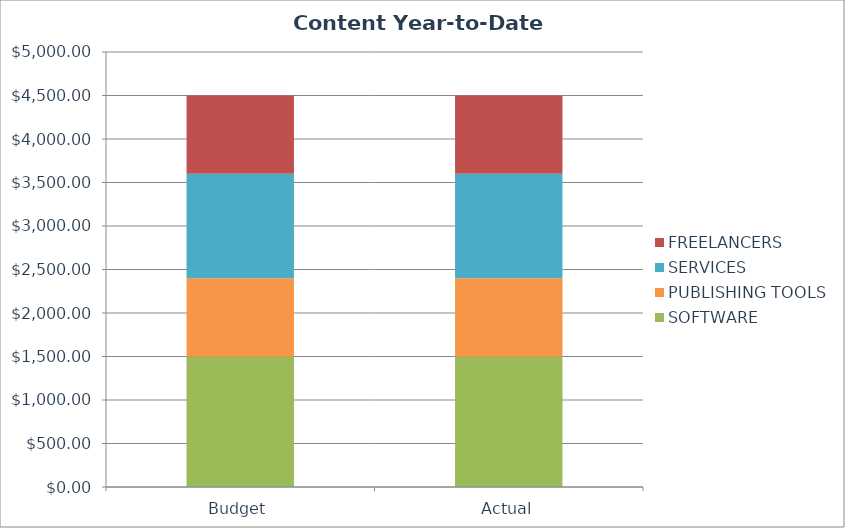
| Category | SOFTWARE | PUBLISHING TOOLS | SERVICES | FREELANCERS |
|---|---|---|---|---|
| Budget | 1500 | 900 | 1200 | 900 |
| Actual | 1500 | 900 | 1200 | 900 |